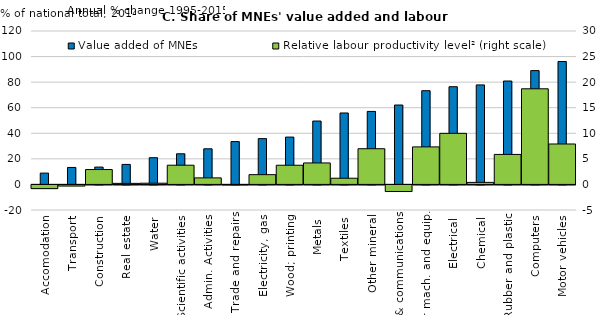
| Category | Value added of MNEs |
|---|---|
| Accomodation | 8.845 |
| Transport | 13.28 |
| Construction | 13.562 |
| Real estate | 15.653 |
| Water | 20.899 |
| Scientific activities | 23.966 |
| Admin. Activities | 27.863 |
| Trade and repairs | 33.501 |
| Electricity, gas | 35.814 |
| Wood; printing | 37.032 |
| Metals | 49.578 |
| Textiles | 55.882 |
| Other mineral | 57.109 |
| Info. & communications | 62.103 |
| Other mach. and equip. | 73.315 |
| Electrical | 76.43 |
| Chemical | 77.83 |
| Rubber and plastic | 80.874 |
| Computers | 89.013 |
| Motor vehicles | 96.141 |